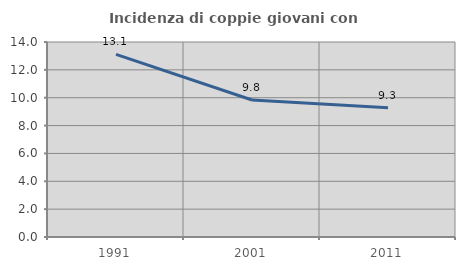
| Category | Incidenza di coppie giovani con figli |
|---|---|
| 1991.0 | 13.117 |
| 2001.0 | 9.835 |
| 2011.0 | 9.282 |